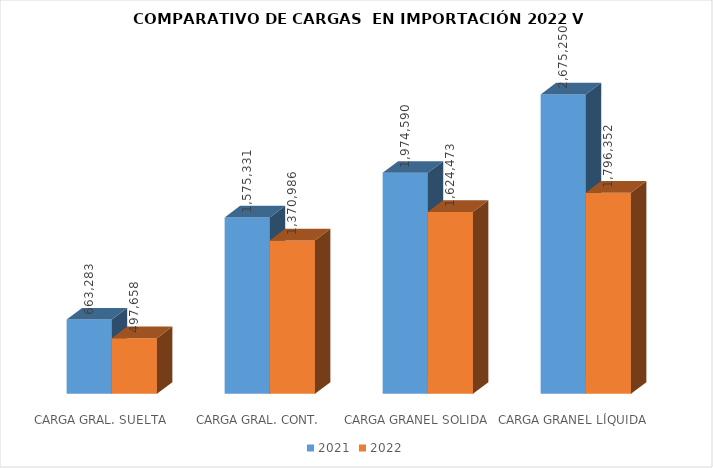
| Category | 2021 | 2022 |
|---|---|---|
|  CARGA GRAL. SUELTA | 663283 | 497658 |
|  CARGA GRAL. CONT. | 1575331 | 1370986 |
|  CARGA GRANEL SOLIDA | 1974590 | 1624473 |
| CARGA GRANEL LÍQUIDA | 2675250 | 1796352 |